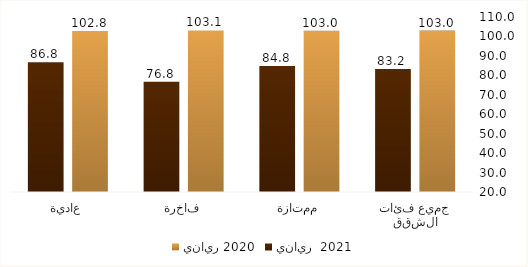
| Category | يناير 2020 | يناير  2021 |
|---|---|---|
| جميع فئات الشقق | 102.995 | 83.226 |
| ممتازة | 102.984 | 84.834 |
| فاخرة | 103.101 | 76.755 |
| عادية | 102.779 | 86.759 |